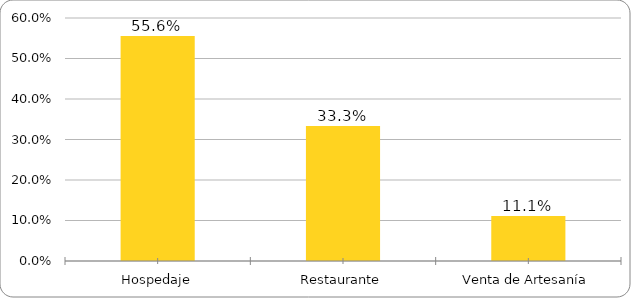
| Category | Series 0 |
|---|---|
| Hospedaje | 0.556 |
| Restaurante | 0.333 |
| Venta de Artesanía | 0.111 |